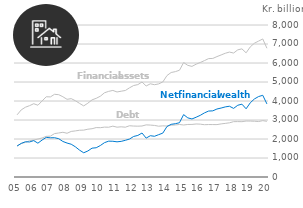
| Category | Series 1 | Series 2 | Series 3 |
|---|---|---|---|
| 05 | 3272.186 | 1643.093 | 1629.093 |
|  | 3532.802 | 1764.809 | 1767.993 |
|  | 3672.547 | 1817.598 | 1854.949 |
|  | 3755.667 | 1911.022 | 1844.645 |
| 06 | 3857.724 | 1942.636 | 1915.088 |
|  | 3776.527 | 1996.758 | 1779.769 |
|  | 3998.384 | 2053.714 | 1944.67 |
|  | 4222.361 | 2138.443 | 2083.918 |
| 07 | 4215.558 | 2151.845 | 2063.713 |
|  | 4353.072 | 2285.058 | 2068.014 |
|  | 4331.642 | 2315.875 | 2015.767 |
|  | 4223.693 | 2352.937 | 1870.756 |
| 08 | 4088.421 | 2302.067 | 1786.354 |
|  | 4123.649 | 2398.769 | 1724.88 |
|  | 4014.451 | 2425.657 | 1588.794 |
|  | 3875.599 | 2461.751 | 1413.848 |
| 09 | 3742.045 | 2467.138 | 1274.907 |
|  | 3885.643 | 2515.771 | 1369.872 |
|  | 4059.448 | 2540.788 | 1518.66 |
|  | 4140.374 | 2601.547 | 1538.827 |
| 10 | 4252.82 | 2594.971 | 1657.849 |
|  | 4434.044 | 2625.297 | 1808.747 |
|  | 4507.349 | 2620.645 | 1886.704 |
|  | 4556.922 | 2675.662 | 1881.26 |
| 11 | 4474.269 | 2623.007 | 1851.262 |
|  | 4515.962 | 2640.884 | 1875.078 |
|  | 4552.115 | 2620.915 | 1931.2 |
|  | 4694.229 | 2697.12 | 1997.109 |
| 12 | 4815.488 | 2681.106 | 2134.382 |
|  | 4862.275 | 2675.466 | 2186.809 |
|  | 4999.558 | 2684.209 | 2315.349 |
|  | 4790.627 | 2743.915 | 2046.712 |
| 13 | 4905.401 | 2732.392 | 2173.009 |
|  | 4857.483 | 2714.159 | 2143.324 |
|  | 4900.307 | 2673.057 | 2227.25 |
|  | 5002.555 | 2692.516 | 2310.039 |
| 14 | 5338.91 | 2682.556 | 2656.354 |
|  | 5500.679 | 2727.766 | 2772.913 |
|  | 5544.028 | 2739.008 | 2805.02 |
|  | 5619.862 | 2763.566 | 2856.296 |
| 15 | 6021.801 | 2737.414 | 3284.387 |
|  | 5876.944 | 2764.859 | 3112.085 |
|  | 5821.519 | 2766.914 | 3054.605 |
|  | 5936.043 | 2789.814 | 3146.229 |
| 16 | 6027.446 | 2781.382 | 3246.064 |
|  | 6126.14 | 2751.859 | 3374.281 |
|  | 6231.476 | 2760.735 | 3470.741 |
|  | 6240.793 | 2759.358 | 3481.435 |
| 17 | 6336.018 | 2757.806 | 3578.212 |
|  | 6423.828 | 2794.409 | 3629.419 |
|  | 6511.708 | 2822.183 | 3689.525 |
|  | 6575.343 | 2851.35 | 3723.993 |
| 18 | 6524.473 | 2913.405 | 3611.068 |
|  | 6691.653 | 2915.576 | 3776.077 |
|  | 6744.533 | 2911.472 | 3833.061 |
|  | 6535.835 | 2945.469 | 3590.366 |
| 19 | 6846.667 | 2942.435 | 3904.232 |
|  | 7043.244 | 2934.991 | 4108.253 |
|  | 7152.493 | 2918.939 | 4233.554 |
|  | 7264.861 | 2964.326 | 4300.535 |
| 20 | 6777.512 | 2930.815 | 3846.697 |